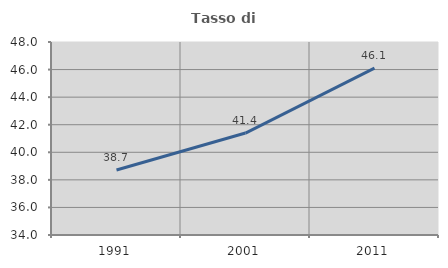
| Category | Tasso di occupazione   |
|---|---|
| 1991.0 | 38.714 |
| 2001.0 | 41.395 |
| 2011.0 | 46.111 |